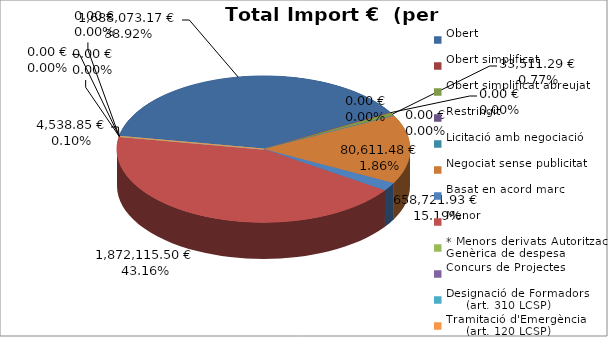
| Category | Total preu
(amb IVA) |
|---|---|
| Obert | 1688073.17 |
| Obert simplificat | 0 |
| Obert simplificat abreujat | 33511.29 |
| Restringit | 0 |
| Licitació amb negociació | 0 |
| Negociat sense publicitat | 658721.93 |
| Basat en acord marc | 80611.48 |
| Menor | 1872115.5 |
| * Menors derivats Autorització Genèrica de despesa | 4538.85 |
| Concurs de Projectes | 0 |
| Designació de Formadors
     (art. 310 LCSP) | 0 |
| Tramitació d'Emergència
     (art. 120 LCSP) | 0 |